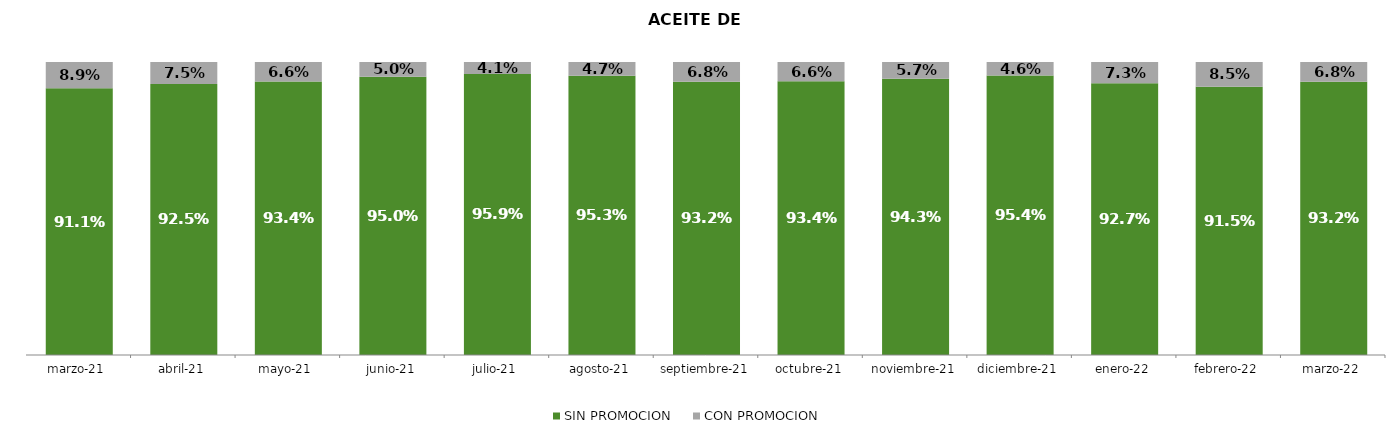
| Category | SIN PROMOCION   | CON PROMOCION   |
|---|---|---|
| 2021-03-01 | 0.911 | 0.089 |
| 2021-04-01 | 0.925 | 0.075 |
| 2021-05-01 | 0.934 | 0.066 |
| 2021-06-01 | 0.95 | 0.05 |
| 2021-07-01 | 0.959 | 0.041 |
| 2021-08-01 | 0.953 | 0.047 |
| 2021-09-01 | 0.932 | 0.068 |
| 2021-10-01 | 0.934 | 0.066 |
| 2021-11-01 | 0.943 | 0.057 |
| 2021-12-01 | 0.954 | 0.046 |
| 2022-01-01 | 0.927 | 0.073 |
| 2022-02-01 | 0.915 | 0.085 |
| 2022-03-01 | 0.932 | 0.068 |